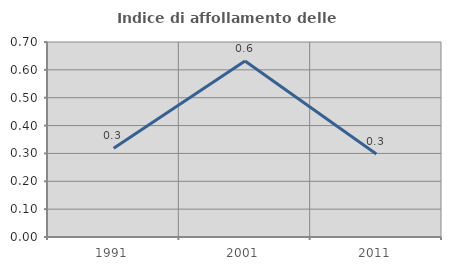
| Category | Indice di affollamento delle abitazioni  |
|---|---|
| 1991.0 | 0.319 |
| 2001.0 | 0.632 |
| 2011.0 | 0.298 |